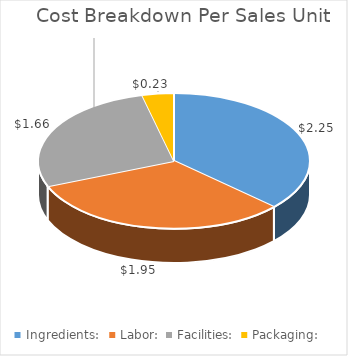
| Category | Client Cost:  |
|---|---|
| Ingredients:   | 2.246 |
| Labor:  | 1.951 |
| Facilities:  | 1.664 |
| Packaging:  | 0.23 |